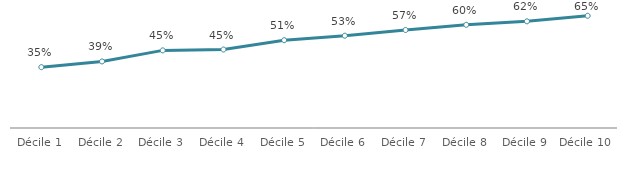
| Category | Vélo |
|---|---|
| Décile 1 | 0.352 |
| Décile 2 | 0.385 |
| Décile 3 | 0.449 |
| Décile 4 | 0.454 |
| Décile 5 | 0.508 |
| Décile 6 | 0.534 |
| Décile 7 | 0.567 |
| Décile 8 | 0.597 |
| Décile 9 | 0.617 |
| Décile 10 | 0.649 |